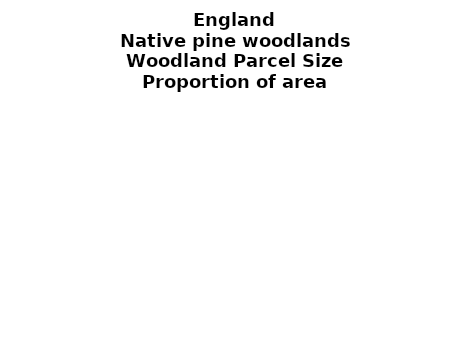
| Category | Native pine woodlands |
|---|---|
| <5 ha | 0 |
| ≥5 and <10 ha | 0 |
| ≥10 and <15 ha | 0 |
| ≥15 and <20 ha | 0 |
| ≥20 and <25 ha | 0 |
| ≥25 and <30 ha | 0 |
| ≥30 and <35 ha | 0 |
| ≥35 and <40 ha | 0 |
| ≥40 and <45 ha | 0 |
| ≥45 and <50 ha | 0 |
| ≥50 and <60 ha | 0 |
| ≥60 and <70 ha | 0 |
| ≥70 and <80 ha | 0 |
| ≥80 and <90 ha | 0 |
| ≥90 and <100 ha | 0 |
| ≥100 and <150 ha | 0 |
| ≥150 and <200 ha | 0 |
| ≥200 ha | 0 |